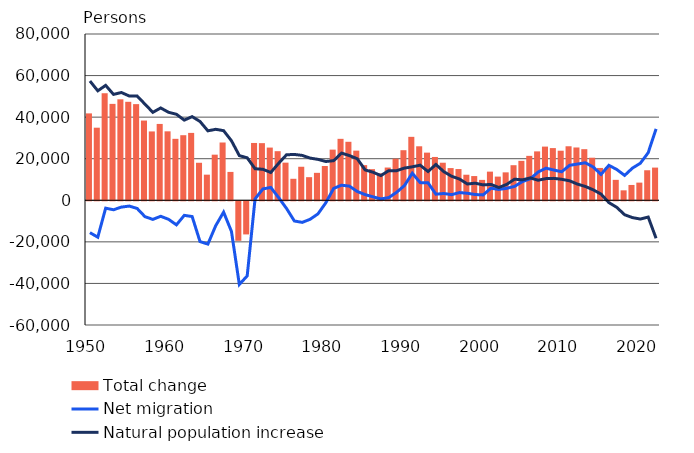
| Category | Total change |
|---|---|
| 1950.0 | 41807 |
| 1951.0 | 34924 |
| 1952.0 | 51501 |
| 1953.0 | 46381 |
| 1954.0 | 48582 |
| 1955.0 | 47380 |
| 1956.0 | 46261 |
| 1957.0 | 38358 |
| 1958.0 | 33124 |
| 1959.0 | 36732 |
| 1960.0 | 33176 |
| 1961.0 | 29565 |
| 1962.0 | 31311 |
| 1963.0 | 32421 |
| 1964.0 | 18048 |
| 1965.0 | 12329 |
| 1966.0 | 21946 |
| 1967.0 | 27803 |
| 1968.0 | 13647 |
| 1969.0 | -19015 |
| 1970.0 | -15941 |
| 1971.0 | 27576 |
| 1972.0 | 27489 |
| 1973.0 | 25360 |
| 1974.0 | 23626 |
| 1975.0 | 18105 |
| 1976.0 | 10344 |
| 1977.0 | 16131 |
| 1978.0 | 11121 |
| 1979.0 | 13204 |
| 1980.0 | 16486 |
| 1981.0 | 24372 |
| 1982.0 | 29565 |
| 1983.0 | 28143 |
| 1984.0 | 23890 |
| 1985.0 | 16916 |
| 1986.0 | 14980 |
| 1987.0 | 12958 |
| 1988.0 | 15757 |
| 1989.0 | 20024 |
| 1990.0 | 24095 |
| 1991.0 | 30524 |
| 1992.0 | 25980 |
| 1993.0 | 22930 |
| 1994.0 | 20842 |
| 1995.0 | 18072 |
| 1996.0 | 15494 |
| 1997.0 | 15029 |
| 1998.0 | 12297 |
| 1999.0 | 11656 |
| 2000.0 | 9813 |
| 2001.0 | 13786 |
| 2002.0 | 11394 |
| 2003.0 | 13437 |
| 2004.0 | 16879 |
| 2005.0 | 18969 |
| 2006.0 | 21375 |
| 2007.0 | 23529 |
| 2008.0 | 25830 |
| 2009.0 | 25113 |
| 2010.0 | 23849 |
| 2011.0 | 25991 |
| 2012.0 | 25407 |
| 2013.0 | 24596 |
| 2014.0 | 20483 |
| 2015.0 | 15555 |
| 2016.0 | 15989 |
| 2017.0 | 9833 |
| 2018.0 | 4789 |
| 2019.0 | 7373 |
| 2020.0 | 8501 |
| 2021.0 | 14448 |
| 2022.0 | 15729 |